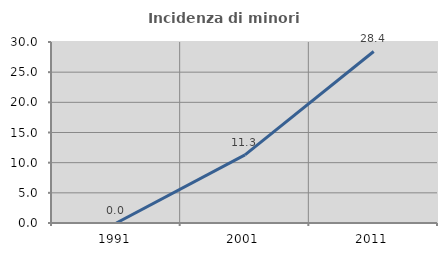
| Category | Incidenza di minori stranieri |
|---|---|
| 1991.0 | 0 |
| 2001.0 | 11.29 |
| 2011.0 | 28.431 |